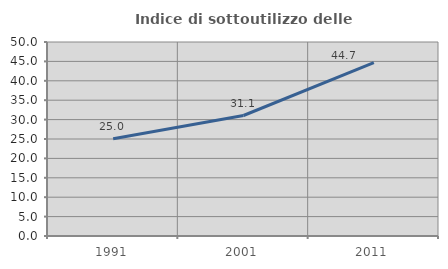
| Category | Indice di sottoutilizzo delle abitazioni  |
|---|---|
| 1991.0 | 25.04 |
| 2001.0 | 31.056 |
| 2011.0 | 44.688 |